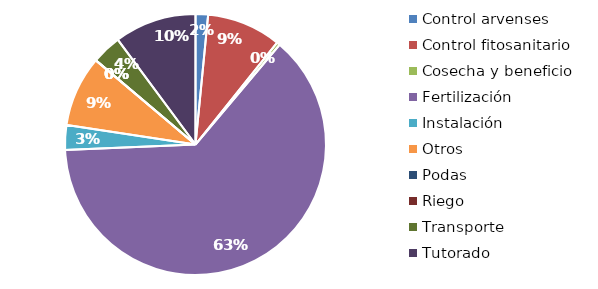
| Category | Valor |
|---|---|
| Control arvenses | 977652 |
| Control fitosanitario | 5809520 |
| Cosecha y beneficio | 256746.881 |
| Fertilización | 39908572 |
| Instalación | 1939754.728 |
| Otros | 5541471 |
| Podas | 0 |
| Riego | 0 |
| Transporte | 2321435 |
| Tutorado | 6418500 |